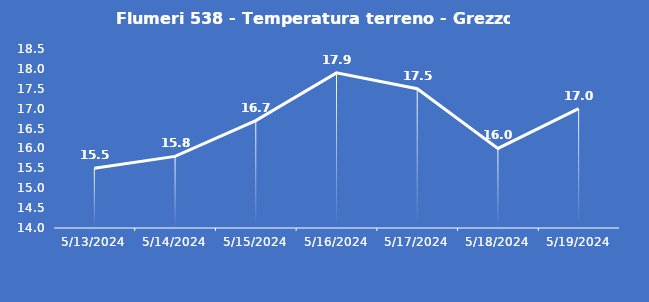
| Category | Flumeri 538 - Temperatura terreno - Grezzo (°C) |
|---|---|
| 5/13/24 | 15.5 |
| 5/14/24 | 15.8 |
| 5/15/24 | 16.7 |
| 5/16/24 | 17.9 |
| 5/17/24 | 17.5 |
| 5/18/24 | 16 |
| 5/19/24 | 17 |